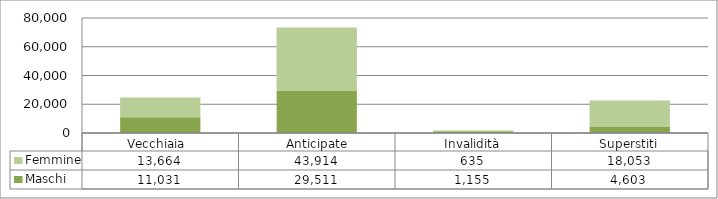
| Category | Maschi | Femmine |
|---|---|---|
| Vecchiaia  | 11031 | 13664 |
|  Anticipate | 29511 | 43914 |
| Invalidità | 1155 | 635 |
| Superstiti | 4603 | 18053 |